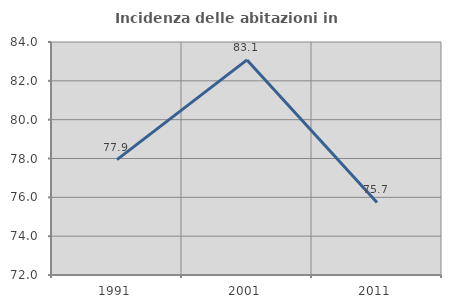
| Category | Incidenza delle abitazioni in proprietà  |
|---|---|
| 1991.0 | 77.94 |
| 2001.0 | 83.079 |
| 2011.0 | 75.737 |